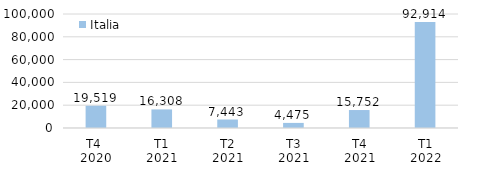
| Category | Italia |
|---|---|
| T4 
2020 | 19518.783 |
| T1
2021 | 16308.244 |
| T2
2021 | 7443.22 |
| T3
2021 | 4474.609 |
| T4
2021 | 15752.141 |
| T1
2022 | 92913.756 |